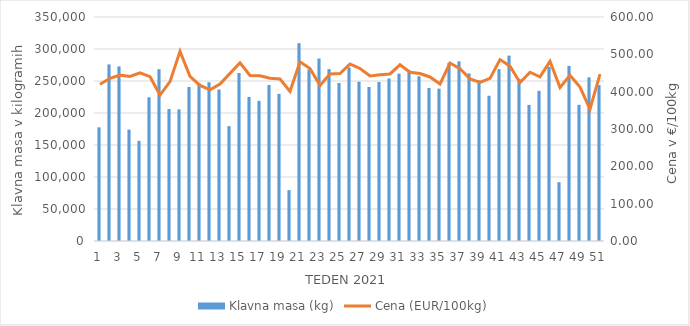
| Category | Klavna masa (kg) |
|---|---|
| 1.0 | 177573 |
| 2.0 | 275951 |
| 3.0 | 272797 |
| 4.0 | 174056 |
| 5.0 | 156508 |
| 6.0 | 224595 |
| 7.0 | 268436 |
| 8.0 | 206193 |
| 9.0 | 205669 |
| 10.0 | 240592 |
| 11.0 | 246325 |
| 12.0 | 248020 |
| 13.0 | 236703 |
| 14.0 | 179478 |
| 15.0 | 262544 |
| 16.0 | 225033 |
| 17.0 | 218950 |
| 18.0 | 243711 |
| 19.0 | 229955 |
| 20.0 | 79521 |
| 21.0 | 309134 |
| 22.0 | 268074 |
| 23.0 | 285151 |
| 24.0 | 268579 |
| 25.0 | 246944 |
| 26.0 | 271319 |
| 27.0 | 248858 |
| 28.0 | 240609 |
| 29.0 | 248383 |
| 30.0 | 253894 |
| 31.0 | 261374 |
| 32.0 | 267142 |
| 33.0 | 257352 |
| 34.0 | 239018 |
| 35.0 | 238034 |
| 36.0 | 278443 |
| 37.0 | 280772 |
| 38.0 | 261791 |
| 39.0 | 250972 |
| 40.0 | 226992 |
| 41.0 | 268523 |
| 42.0 | 289650 |
| 43.0 | 253458 |
| 44.0 | 212689 |
| 45.0 | 234635 |
| 46.0 | 272042 |
| 47.0 | 91884 |
| 48.0 | 273642 |
| 49.0 | 212789 |
| 50.0 | 255740 |
| 51.0 | 243582 |